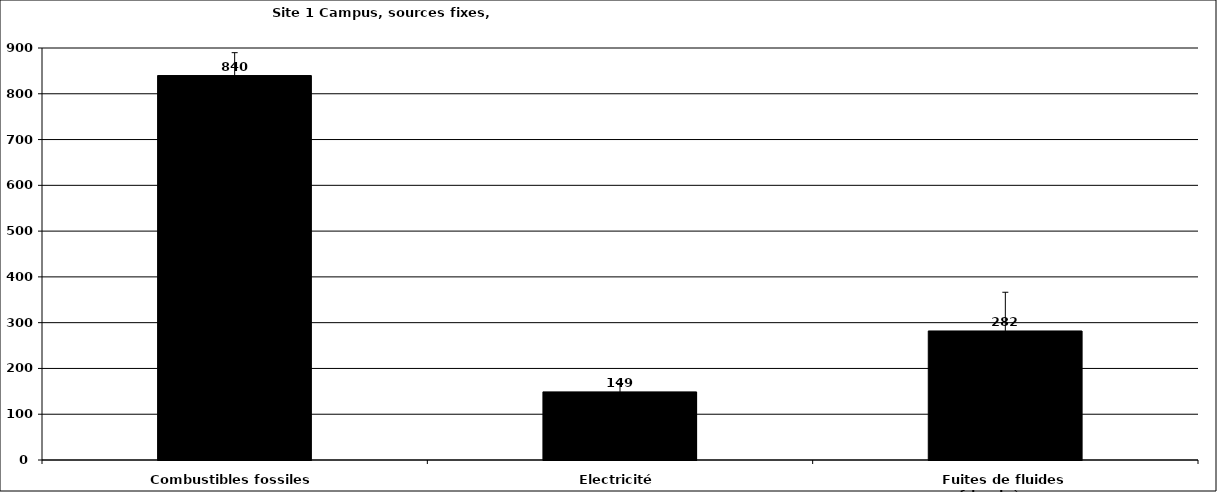
| Category | Series 0 |
|---|---|
| Combustibles fossiles | 839.857 |
| Electricité | 148.816 |
| Fuites de fluides frigorigènes | 281.88 |